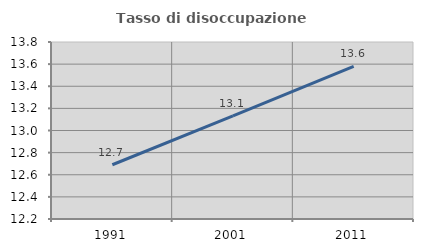
| Category | Tasso di disoccupazione giovanile  |
|---|---|
| 1991.0 | 12.69 |
| 2001.0 | 13.131 |
| 2011.0 | 13.58 |